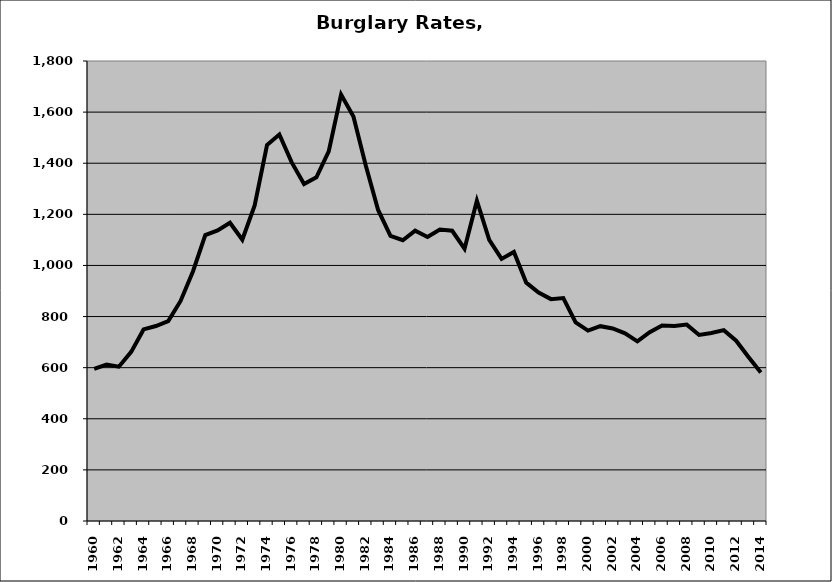
| Category | Burglary |
|---|---|
| 1960.0 | 595.211 |
| 1961.0 | 611.741 |
| 1962.0 | 603.728 |
| 1963.0 | 661.83 |
| 1964.0 | 749.626 |
| 1965.0 | 762.975 |
| 1966.0 | 782.165 |
| 1967.0 | 861.069 |
| 1968.0 | 976.616 |
| 1969.0 | 1118.835 |
| 1970.0 | 1137.042 |
| 1971.0 | 1167.13 |
| 1972.0 | 1100.61 |
| 1973.0 | 1234.812 |
| 1974.0 | 1471.279 |
| 1975.0 | 1512.639 |
| 1976.0 | 1403.181 |
| 1977.0 | 1318.267 |
| 1978.0 | 1345.165 |
| 1979.0 | 1446.652 |
| 1980.0 | 1668.908 |
| 1981.0 | 1583.09 |
| 1982.0 | 1391.254 |
| 1983.0 | 1217.223 |
| 1984.0 | 1115.475 |
| 1985.0 | 1098.668 |
| 1986.0 | 1136.123 |
| 1987.0 | 1111.327 |
| 1988.0 | 1140.397 |
| 1989.0 | 1135.763 |
| 1990.0 | 1065.766 |
| 1991.0 | 1253.257 |
| 1992.0 | 1100.077 |
| 1993.0 | 1025.468 |
| 1994.0 | 1052.994 |
| 1995.0 | 932.551 |
| 1996.0 | 894.178 |
| 1997.0 | 868.197 |
| 1998.0 | 872.495 |
| 1999.0 | 776.763 |
| 2000.0 | 745.012 |
| 2001.0 | 762.367 |
| 2002.0 | 753.517 |
| 2003.0 | 734.315 |
| 2004.0 | 702.696 |
| 2005.0 | 738.603 |
| 2006.0 | 765.175 |
| 2007.0 | 763.25 |
| 2008.0 | 768.459 |
| 2009.0 | 728.024 |
| 2010.0 | 735.407 |
| 2011.0 | 746.798 |
| 2012.0 | 705.616 |
| 2013.0 | 641.812 |
| 2014.0 | 581.471 |